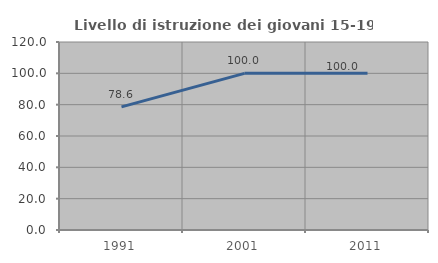
| Category | Livello di istruzione dei giovani 15-19 anni |
|---|---|
| 1991.0 | 78.571 |
| 2001.0 | 100 |
| 2011.0 | 100 |